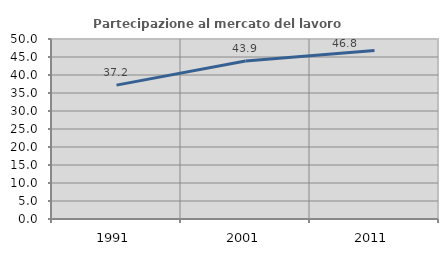
| Category | Partecipazione al mercato del lavoro  femminile |
|---|---|
| 1991.0 | 37.193 |
| 2001.0 | 43.884 |
| 2011.0 | 46.782 |